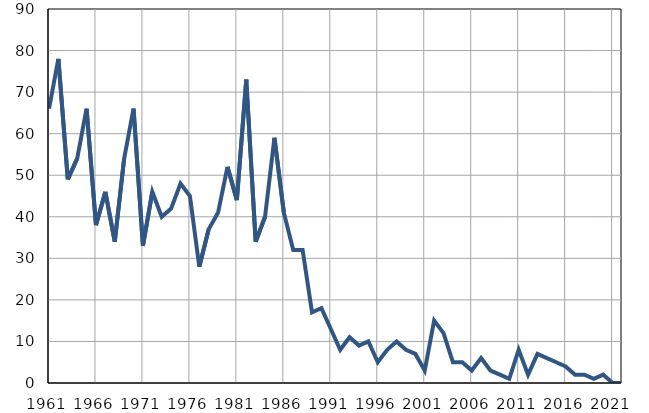
| Category | Умрла 
одојчад |
|---|---|
| 1961.0 | 66 |
| 1962.0 | 78 |
| 1963.0 | 49 |
| 1964.0 | 54 |
| 1965.0 | 66 |
| 1966.0 | 38 |
| 1967.0 | 46 |
| 1968.0 | 34 |
| 1969.0 | 54 |
| 1970.0 | 66 |
| 1971.0 | 33 |
| 1972.0 | 46 |
| 1973.0 | 40 |
| 1974.0 | 42 |
| 1975.0 | 48 |
| 1976.0 | 45 |
| 1977.0 | 28 |
| 1978.0 | 37 |
| 1979.0 | 41 |
| 1980.0 | 52 |
| 1981.0 | 44 |
| 1982.0 | 73 |
| 1983.0 | 34 |
| 1984.0 | 40 |
| 1985.0 | 59 |
| 1986.0 | 41 |
| 1987.0 | 32 |
| 1988.0 | 32 |
| 1989.0 | 17 |
| 1990.0 | 18 |
| 1991.0 | 13 |
| 1992.0 | 8 |
| 1993.0 | 11 |
| 1994.0 | 9 |
| 1995.0 | 10 |
| 1996.0 | 5 |
| 1997.0 | 8 |
| 1998.0 | 10 |
| 1999.0 | 8 |
| 2000.0 | 7 |
| 2001.0 | 3 |
| 2002.0 | 15 |
| 2003.0 | 12 |
| 2004.0 | 5 |
| 2005.0 | 5 |
| 2006.0 | 3 |
| 2007.0 | 6 |
| 2008.0 | 3 |
| 2009.0 | 2 |
| 2010.0 | 1 |
| 2011.0 | 8 |
| 2012.0 | 2 |
| 2013.0 | 7 |
| 2014.0 | 6 |
| 2015.0 | 5 |
| 2016.0 | 4 |
| 2017.0 | 2 |
| 2018.0 | 2 |
| 2019.0 | 1 |
| 2020.0 | 2 |
| 2021.0 | 0 |
| 2022.0 | 0 |